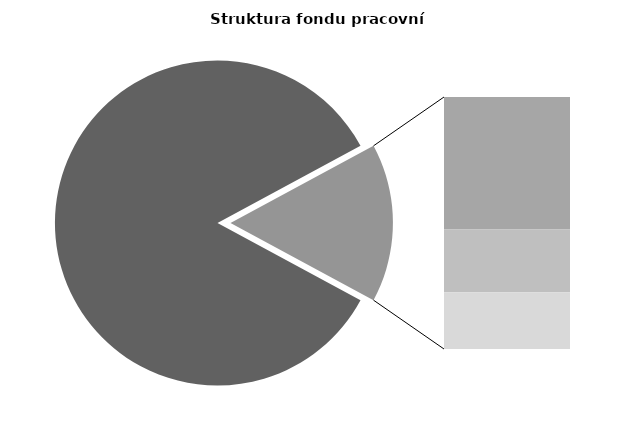
| Category | Series 0 |
|---|---|
| Průměrná měsíční odpracovaná doba bez přesčasu | 142.611 |
| Dovolená | 14.018 |
| Nemoc | 6.644 |
| Jiné | 6 |